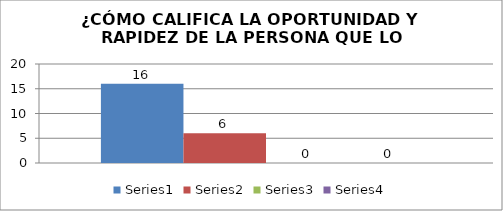
| Category | Series 0 | Series 1 | Series 2 | Series 3 |
|---|---|---|---|---|
| 0 | 16 | 6 | 0 | 0 |